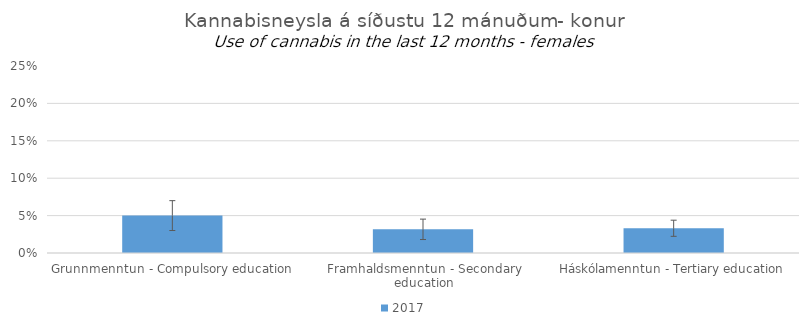
| Category | 2017 |
|---|---|
| Grunnmenntun - Compulsory education | 0.05 |
| Framhaldsmenntun - Secondary education | 0.032 |
| Háskólamenntun - Tertiary education | 0.033 |